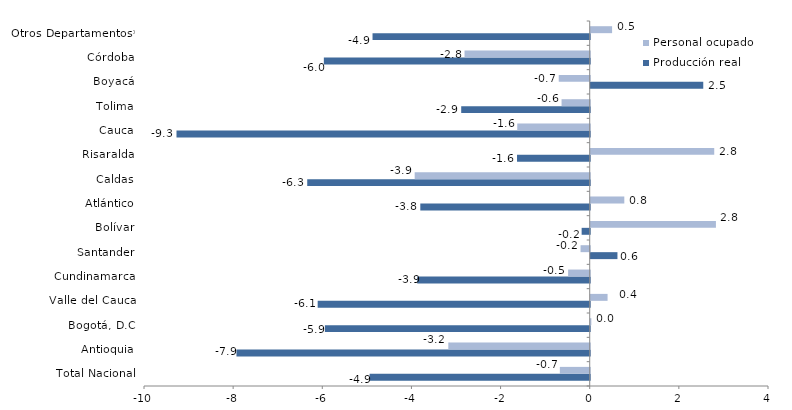
| Category | Producción real | Personal ocupado |
|---|---|---|
| Total Nacional | -4.938 | -0.67 |
| Antioquia | -7.926 | -3.173 |
| Bogotá, D.C | -5.941 | 0.014 |
| Valle del Cauca | -6.103 | 0.378 |
| Cundinamarca | -3.869 | -0.485 |
| Santander | 0.6 | -0.206 |
| Bolívar | -0.181 | 2.809 |
| Atlántico | -3.801 | 0.754 |
| Caldas | -6.338 | -3.927 |
| Risaralda | -1.631 | 2.772 |
| Cauca | -9.271 | -1.625 |
| Tolima | -2.883 | -0.632 |
| Boyacá | 2.525 | -0.695 |
| Córdoba | -5.965 | -2.809 |
| Otros Departamentos* | -4.873 | 0.48 |